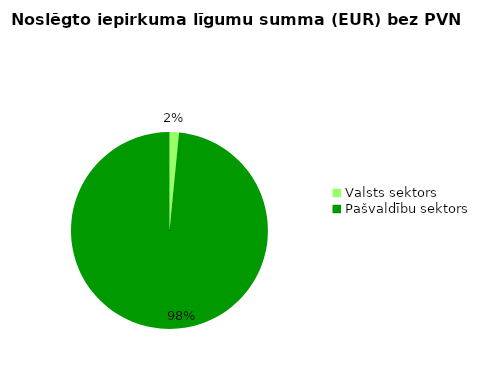
| Category | Noslēgto iepirkuma līgumu summa (EUR) bez PVN |
|---|---|
| Valsts sektors | 39586 |
| Pašvaldību sektors | 2527669 |